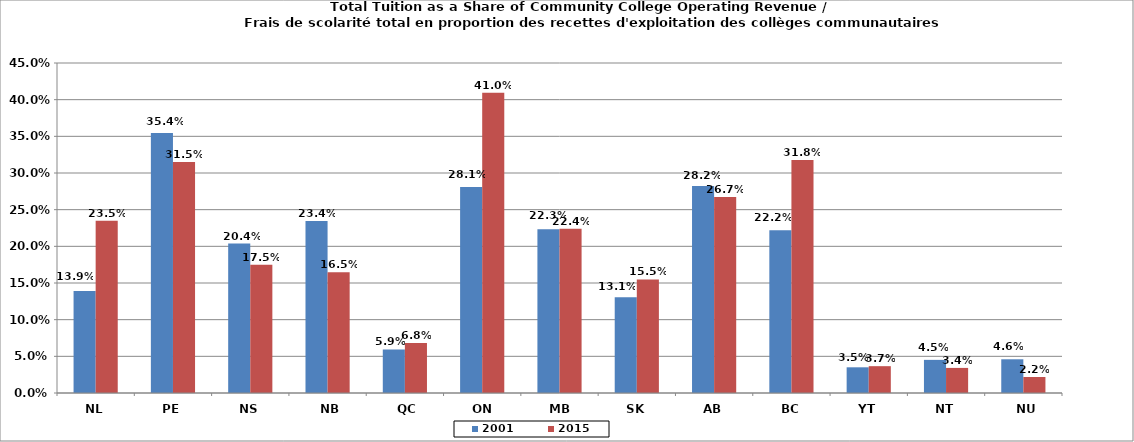
| Category | 2001 | 2015 |
|---|---|---|
| NL | 0.139 | 0.235 |
| PE | 0.354 | 0.315 |
| NS | 0.204 | 0.175 |
| NB | 0.234 | 0.165 |
| QC | 0.059 | 0.068 |
| ON | 0.281 | 0.41 |
| MB | 0.223 | 0.224 |
| SK | 0.131 | 0.155 |
| AB | 0.282 | 0.267 |
| BC | 0.222 | 0.318 |
| YT | 0.035 | 0.037 |
| NT | 0.045 | 0.034 |
| NU | 0.046 | 0.022 |